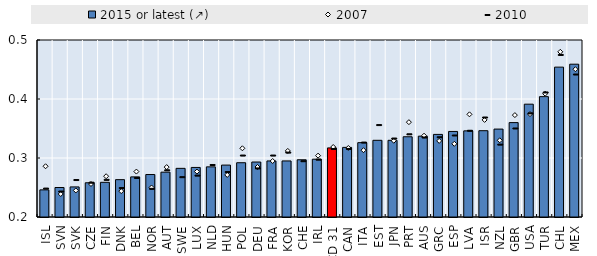
| Category | 2015 or latest (↗) |
|---|---|
| ISL | 0.246 |
| SVN | 0.25 |
| SVK | 0.251 |
| CZE | 0.258 |
| FIN | 0.259 |
| DNK | 0.263 |
| BEL | 0.268 |
| NOR | 0.272 |
| AUT | 0.276 |
| SWE | 0.282 |
| LUX | 0.284 |
| NLD | 0.285 |
| HUN | 0.288 |
| POL | 0.292 |
| DEU | 0.293 |
| FRA | 0.295 |
| KOR | 0.295 |
| CHE | 0.297 |
| IRL | 0.298 |
| OECD 31 | 0.317 |
| CAN | 0.318 |
| ITA | 0.326 |
| EST | 0.33 |
| JPN | 0.33 |
| PRT | 0.336 |
| AUS | 0.337 |
| GRC | 0.34 |
| ESP | 0.345 |
| LVA | 0.346 |
| ISR | 0.346 |
| NZL | 0.349 |
| GBR | 0.36 |
| USA | 0.391 |
| TUR | 0.404 |
| CHL | 0.454 |
| MEX | 0.459 |